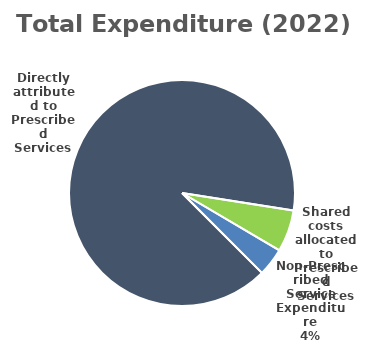
| Category | Series 0 |
|---|---|
| Directly attributed to Prescribed Services | 321.578 |
| Shared costs allocated to Prescribed Services | 21.391 |
| Non-Prescribed Service Expenditure | 14.447 |